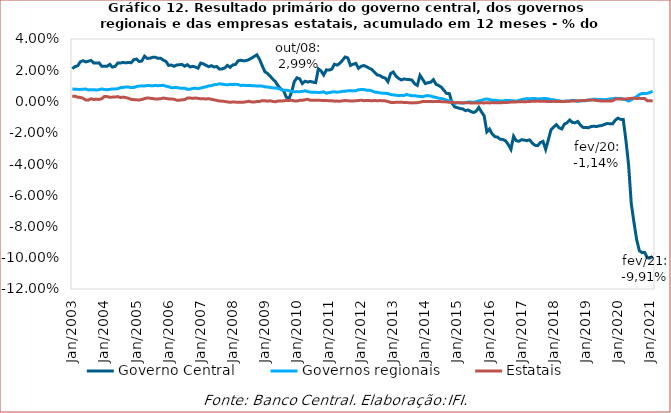
| Category | Governo Central | Governos regionais | Estatais |
|---|---|---|---|
| 2003-01-01 | 0.021 | 0.008 | 0.003 |
| 2003-02-01 | 0.022 | 0.008 | 0.003 |
| 2003-03-01 | 0.023 | 0.008 | 0.003 |
| 2003-04-01 | 0.025 | 0.008 | 0.003 |
| 2003-05-01 | 0.026 | 0.008 | 0.002 |
| 2003-06-01 | 0.025 | 0.008 | 0.001 |
| 2003-07-01 | 0.026 | 0.007 | 0.001 |
| 2003-08-01 | 0.026 | 0.008 | 0.002 |
| 2003-09-01 | 0.025 | 0.008 | 0.001 |
| 2003-10-01 | 0.025 | 0.007 | 0.001 |
| 2003-11-01 | 0.025 | 0.008 | 0.001 |
| 2003-12-01 | 0.023 | 0.008 | 0.002 |
| 2004-01-01 | 0.023 | 0.008 | 0.003 |
| 2004-02-01 | 0.023 | 0.008 | 0.003 |
| 2004-03-01 | 0.024 | 0.008 | 0.003 |
| 2004-04-01 | 0.022 | 0.008 | 0.003 |
| 2004-05-01 | 0.023 | 0.008 | 0.003 |
| 2004-06-01 | 0.025 | 0.008 | 0.003 |
| 2004-07-01 | 0.025 | 0.009 | 0.003 |
| 2004-08-01 | 0.025 | 0.009 | 0.003 |
| 2004-09-01 | 0.025 | 0.009 | 0.002 |
| 2004-10-01 | 0.025 | 0.009 | 0.002 |
| 2004-11-01 | 0.025 | 0.009 | 0.001 |
| 2004-12-01 | 0.027 | 0.009 | 0.001 |
| 2005-01-01 | 0.027 | 0.01 | 0.001 |
| 2005-02-01 | 0.026 | 0.01 | 0.001 |
| 2005-03-01 | 0.026 | 0.01 | 0.001 |
| 2005-04-01 | 0.029 | 0.01 | 0.002 |
| 2005-05-01 | 0.028 | 0.01 | 0.002 |
| 2005-06-01 | 0.028 | 0.01 | 0.002 |
| 2005-07-01 | 0.028 | 0.01 | 0.002 |
| 2005-08-01 | 0.028 | 0.01 | 0.002 |
| 2005-09-01 | 0.028 | 0.01 | 0.002 |
| 2005-10-01 | 0.028 | 0.01 | 0.002 |
| 2005-11-01 | 0.027 | 0.01 | 0.002 |
| 2005-12-01 | 0.026 | 0.01 | 0.002 |
| 2006-01-01 | 0.023 | 0.009 | 0.002 |
| 2006-02-01 | 0.023 | 0.009 | 0.002 |
| 2006-03-01 | 0.023 | 0.009 | 0.002 |
| 2006-04-01 | 0.023 | 0.009 | 0.001 |
| 2006-05-01 | 0.024 | 0.009 | 0.001 |
| 2006-06-01 | 0.024 | 0.008 | 0.001 |
| 2006-07-01 | 0.023 | 0.009 | 0.001 |
| 2006-08-01 | 0.024 | 0.008 | 0.002 |
| 2006-09-01 | 0.022 | 0.008 | 0.002 |
| 2006-10-01 | 0.023 | 0.008 | 0.002 |
| 2006-11-01 | 0.022 | 0.009 | 0.002 |
| 2006-12-01 | 0.021 | 0.008 | 0.002 |
| 2007-01-01 | 0.025 | 0.009 | 0.002 |
| 2007-02-01 | 0.024 | 0.009 | 0.002 |
| 2007-03-01 | 0.023 | 0.009 | 0.002 |
| 2007-04-01 | 0.022 | 0.01 | 0.002 |
| 2007-05-01 | 0.023 | 0.01 | 0.001 |
| 2007-06-01 | 0.022 | 0.011 | 0.001 |
| 2007-07-01 | 0.022 | 0.011 | 0.001 |
| 2007-08-01 | 0.021 | 0.011 | 0 |
| 2007-09-01 | 0.021 | 0.011 | 0 |
| 2007-10-01 | 0.021 | 0.011 | 0 |
| 2007-11-01 | 0.023 | 0.011 | 0 |
| 2007-12-01 | 0.022 | 0.011 | 0 |
| 2008-01-01 | 0.023 | 0.011 | 0 |
| 2008-02-01 | 0.024 | 0.011 | 0 |
| 2008-03-01 | 0.026 | 0.011 | -0.001 |
| 2008-04-01 | 0.026 | 0.01 | -0.001 |
| 2008-05-01 | 0.026 | 0.01 | 0 |
| 2008-06-01 | 0.026 | 0.01 | 0 |
| 2008-07-01 | 0.027 | 0.01 | 0 |
| 2008-08-01 | 0.028 | 0.01 | 0 |
| 2008-09-01 | 0.029 | 0.01 | 0 |
| 2008-10-01 | 0.03 | 0.01 | 0 |
| 2008-11-01 | 0.027 | 0.01 | 0 |
| 2008-12-01 | 0.023 | 0.01 | 0.001 |
| 2009-01-01 | 0.019 | 0.009 | 0 |
| 2009-02-01 | 0.018 | 0.009 | 0 |
| 2009-03-01 | 0.016 | 0.009 | 0 |
| 2009-04-01 | 0.014 | 0.009 | 0 |
| 2009-05-01 | 0.013 | 0.009 | 0 |
| 2009-06-01 | 0.01 | 0.008 | 0 |
| 2009-07-01 | 0.008 | 0.008 | 0 |
| 2009-08-01 | 0.007 | 0.007 | 0 |
| 2009-09-01 | 0.003 | 0.007 | 0.001 |
| 2009-10-01 | 0.002 | 0.007 | 0.001 |
| 2009-11-01 | 0.006 | 0.006 | 0.001 |
| 2009-12-01 | 0.013 | 0.006 | 0 |
| 2010-01-01 | 0.015 | 0.006 | 0 |
| 2010-02-01 | 0.015 | 0.006 | 0.001 |
| 2010-03-01 | 0.012 | 0.006 | 0.001 |
| 2010-04-01 | 0.013 | 0.007 | 0.001 |
| 2010-05-01 | 0.012 | 0.006 | 0.001 |
| 2010-06-01 | 0.013 | 0.006 | 0.001 |
| 2010-07-01 | 0.012 | 0.006 | 0.001 |
| 2010-08-01 | 0.012 | 0.006 | 0.001 |
| 2010-09-01 | 0.021 | 0.006 | 0.001 |
| 2010-10-01 | 0.02 | 0.006 | 0.001 |
| 2010-11-01 | 0.017 | 0.006 | 0.001 |
| 2010-12-01 | 0.02 | 0.005 | 0.001 |
| 2011-01-01 | 0.02 | 0.006 | 0 |
| 2011-02-01 | 0.021 | 0.006 | 0 |
| 2011-03-01 | 0.024 | 0.006 | 0 |
| 2011-04-01 | 0.023 | 0.006 | 0 |
| 2011-05-01 | 0.024 | 0.006 | 0 |
| 2011-06-01 | 0.026 | 0.006 | 0 |
| 2011-07-01 | 0.028 | 0.007 | 0.001 |
| 2011-08-01 | 0.028 | 0.007 | 0.001 |
| 2011-09-01 | 0.023 | 0.007 | 0 |
| 2011-10-01 | 0.024 | 0.007 | 0 |
| 2011-11-01 | 0.024 | 0.007 | 0 |
| 2011-12-01 | 0.021 | 0.008 | 0.001 |
| 2012-01-01 | 0.023 | 0.008 | 0.001 |
| 2012-02-01 | 0.023 | 0.008 | 0.001 |
| 2012-03-01 | 0.022 | 0.007 | 0.001 |
| 2012-04-01 | 0.021 | 0.007 | 0.001 |
| 2012-05-01 | 0.02 | 0.007 | 0 |
| 2012-06-01 | 0.019 | 0.006 | 0.001 |
| 2012-07-01 | 0.017 | 0.006 | 0 |
| 2012-08-01 | 0.017 | 0.006 | 0.001 |
| 2012-09-01 | 0.015 | 0.005 | 0 |
| 2012-10-01 | 0.015 | 0.005 | 0 |
| 2012-11-01 | 0.013 | 0.005 | 0 |
| 2012-12-01 | 0.018 | 0.004 | -0.001 |
| 2013-01-01 | 0.019 | 0.004 | -0.001 |
| 2013-02-01 | 0.016 | 0.004 | -0.001 |
| 2013-03-01 | 0.015 | 0.004 | 0 |
| 2013-04-01 | 0.014 | 0.004 | 0 |
| 2013-05-01 | 0.014 | 0.004 | -0.001 |
| 2013-06-01 | 0.014 | 0.005 | -0.001 |
| 2013-07-01 | 0.014 | 0.004 | -0.001 |
| 2013-08-01 | 0.014 | 0.004 | -0.001 |
| 2013-09-01 | 0.011 | 0.004 | -0.001 |
| 2013-10-01 | 0.01 | 0.003 | -0.001 |
| 2013-11-01 | 0.017 | 0.003 | 0 |
| 2013-12-01 | 0.014 | 0.003 | 0 |
| 2014-01-01 | 0.011 | 0.004 | 0 |
| 2014-02-01 | 0.012 | 0.004 | 0 |
| 2014-03-01 | 0.012 | 0.003 | 0 |
| 2014-04-01 | 0.014 | 0.003 | 0 |
| 2014-05-01 | 0.011 | 0.003 | 0 |
| 2014-06-01 | 0.01 | 0.002 | 0 |
| 2014-07-01 | 0.009 | 0.002 | 0 |
| 2014-08-01 | 0.007 | 0.002 | 0 |
| 2014-09-01 | 0.005 | 0.001 | 0 |
| 2014-10-01 | 0.005 | 0 | 0 |
| 2014-11-01 | -0.001 | 0 | 0 |
| 2014-12-01 | -0.004 | -0.001 | -0.001 |
| 2015-01-01 | -0.004 | -0.001 | -0.001 |
| 2015-02-01 | -0.005 | -0.001 | -0.001 |
| 2015-03-01 | -0.005 | -0.001 | -0.001 |
| 2015-04-01 | -0.006 | -0.001 | -0.001 |
| 2015-05-01 | -0.005 | 0 | -0.001 |
| 2015-06-01 | -0.006 | 0 | -0.001 |
| 2015-07-01 | -0.007 | -0.001 | -0.001 |
| 2015-08-01 | -0.006 | 0 | -0.001 |
| 2015-09-01 | -0.004 | 0 | -0.001 |
| 2015-10-01 | -0.007 | 0.001 | -0.001 |
| 2015-11-01 | -0.009 | 0.001 | -0.001 |
| 2015-12-01 | -0.019 | 0.002 | -0.001 |
| 2016-01-01 | -0.018 | 0.001 | -0.001 |
| 2016-02-01 | -0.021 | 0.001 | -0.001 |
| 2016-03-01 | -0.023 | 0.001 | -0.001 |
| 2016-04-01 | -0.023 | 0.001 | -0.001 |
| 2016-05-01 | -0.024 | 0 | -0.001 |
| 2016-06-01 | -0.024 | 0 | -0.001 |
| 2016-07-01 | -0.025 | 0.001 | -0.001 |
| 2016-08-01 | -0.028 | 0.001 | -0.001 |
| 2016-09-01 | -0.031 | 0.001 | 0 |
| 2016-10-01 | -0.022 | 0 | 0 |
| 2016-11-01 | -0.025 | 0 | 0 |
| 2016-12-01 | -0.025 | 0.001 | 0 |
| 2017-01-01 | -0.024 | 0.001 | 0 |
| 2017-02-01 | -0.025 | 0.002 | 0 |
| 2017-03-01 | -0.025 | 0.002 | 0 |
| 2017-04-01 | -0.025 | 0.002 | 0 |
| 2017-05-01 | -0.027 | 0.002 | 0 |
| 2017-06-01 | -0.028 | 0.002 | 0 |
| 2017-07-01 | -0.028 | 0.002 | 0 |
| 2017-08-01 | -0.026 | 0.002 | 0 |
| 2017-09-01 | -0.026 | 0.002 | 0 |
| 2017-10-01 | -0.031 | 0.002 | 0 |
| 2017-11-01 | -0.024 | 0.002 | 0 |
| 2017-12-01 | -0.018 | 0.001 | 0 |
| 2018-01-01 | -0.016 | 0.001 | 0 |
| 2018-02-01 | -0.015 | 0.001 | 0 |
| 2018-03-01 | -0.017 | 0.001 | 0 |
| 2018-04-01 | -0.018 | 0 | 0 |
| 2018-05-01 | -0.014 | 0 | 0 |
| 2018-06-01 | -0.014 | 0 | 0 |
| 2018-07-01 | -0.012 | 0 | 0 |
| 2018-08-01 | -0.013 | 0.001 | 0 |
| 2018-09-01 | -0.014 | 0.001 | 0 |
| 2018-10-01 | -0.013 | 0 | 0.001 |
| 2018-11-01 | -0.015 | 0 | 0 |
| 2018-12-01 | -0.017 | 0 | 0.001 |
| 2019-01-01 | -0.017 | 0.001 | 0.001 |
| 2019-02-01 | -0.017 | 0.001 | 0.001 |
| 2019-03-01 | -0.016 | 0.001 | 0.001 |
| 2019-04-01 | -0.016 | 0.002 | 0.001 |
| 2019-05-01 | -0.016 | 0.001 | 0.001 |
| 2019-06-01 | -0.016 | 0.001 | 0 |
| 2019-07-01 | -0.015 | 0.001 | 0 |
| 2019-08-01 | -0.015 | 0.001 | 0 |
| 2019-09-01 | -0.014 | 0.001 | 0 |
| 2019-10-01 | -0.014 | 0.002 | 0 |
| 2019-11-01 | -0.014 | 0.002 | 0 |
| 2019-12-01 | -0.012 | 0.002 | 0.002 |
| 2020-01-01 | -0.011 | 0.002 | 0.002 |
| 2020-02-01 | -0.011 | 0.002 | 0.002 |
| 2020-03-01 | -0.012 | 0.001 | 0.002 |
| 2020-04-01 | -0.025 | 0.001 | 0.002 |
| 2020-05-01 | -0.041 | 0 | 0.002 |
| 2020-06-01 | -0.065 | 0.001 | 0.002 |
| 2020-07-01 | -0.077 | 0.002 | 0.002 |
| 2020-08-01 | -0.088 | 0.003 | 0.002 |
| 2020-09-01 | -0.095 | 0.004 | 0.002 |
| 2020-10-01 | -0.097 | 0.005 | 0.002 |
| 2020-11-01 | -0.097 | 0.005 | 0.002 |
| 2020-12-01 | -0.1 | 0.005 | 0 |
| 2021-01-01 | -0.1 | 0.006 | 0 |
| 2021-02-01 | -0.099 | 0.006 | 0 |